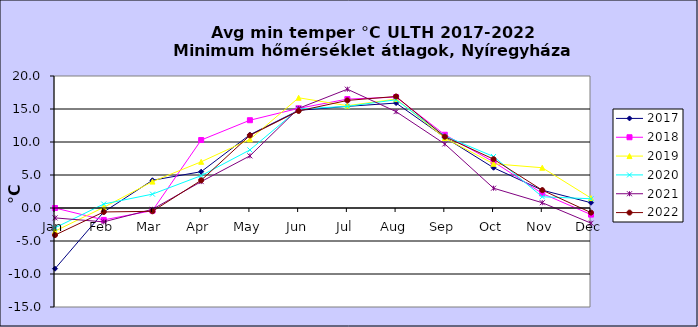
| Category | 2017 | 2018 | 2019 | 2020 | 2021 | 2022 |
|---|---|---|---|---|---|---|
| Jan | -9.2 | 0 | -3.5 | -3 | -1.5 | -4.1 |
| Feb | -0.6 | -1.8 | 0.1 | 0.6 | -2.1 | -0.6 |
| Mar | 4.2 | -0.4 | 4 | 2.1 | -0.2 | -0.5 |
| Apr | 5.5 | 10.3 | 7 | 4.9 | 4 | 4.2 |
| May | 11.1 | 13.3 | 10.4 | 8.8 | 7.9 | 11 |
| Jun | 14.8 | 15.1 | 16.7 | 15 | 15.1 | 14.7 |
| Jul | 15.4 | 16.5 | 15.5 | 15.4 | 18 | 16.3 |
| Aug | 15.9 | 16.8 | 16.5 | 16.4 | 14.6 | 16.9 |
| Sep | 10.7 | 11.1 | 10.6 | 10.9 | 9.7 | 10.8 |
| Oct | 6.1 | 7 | 6.7 | 7.8 | 3 | 7.4 |
| Nov | 2.7 | 2.2 | 6.1 | 1.7 | 0.8 | 2.7 |
| Dec | 0.8 | -1 | 1.5 | 1.4 | -2.3 | -0.7 |